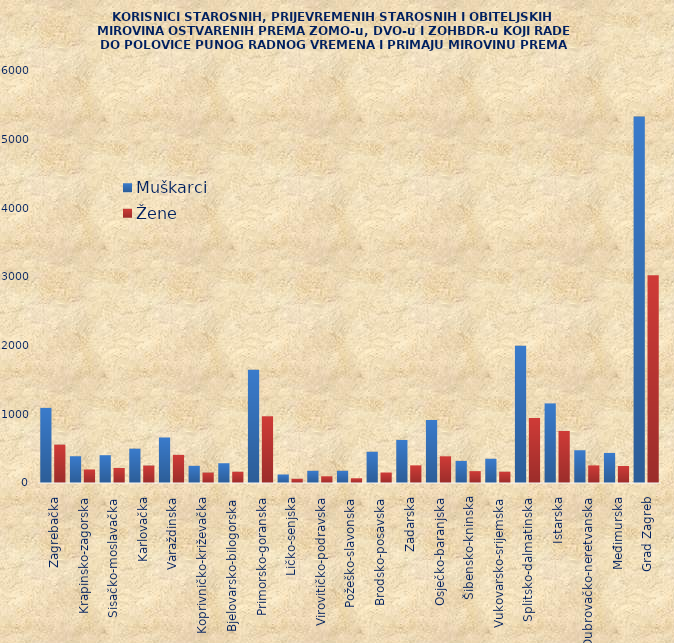
| Category | Muškarci | Žene |
|---|---|---|
| Zagrebačka | 1094 | 559 |
| Krapinsko-zagorska | 390 | 197 |
| Sisačko-moslavačka | 405 | 219 |
| Karlovačka | 500 | 254 |
| Varaždinska | 663 | 410 |
| Koprivničko-križevačka | 250 | 152 |
| Bjelovarsko-bilogorska | 288 | 164 |
| Primorsko-goranska | 1651 | 973 |
| Ličko-senjska | 124 | 62 |
| Virovitičko-podravska | 178 | 98 |
| Požeško-slavonska | 178 | 69 |
| Brodsko-posavska | 455 | 153 |
| Zadarska | 627 | 257 |
| Osječko-baranjska | 918 | 389 |
| Šibensko-kninska | 322 | 173 |
| Vukovarsko-srijemska | 353 | 165 |
| Splitsko-dalmatinska | 1999 | 948 |
| Istarska | 1159 | 758 |
| Dubrovačko-neretvanska | 477 | 256 |
| Međimurska | 438 | 248 |
| Grad Zagreb | 5336 | 3027 |